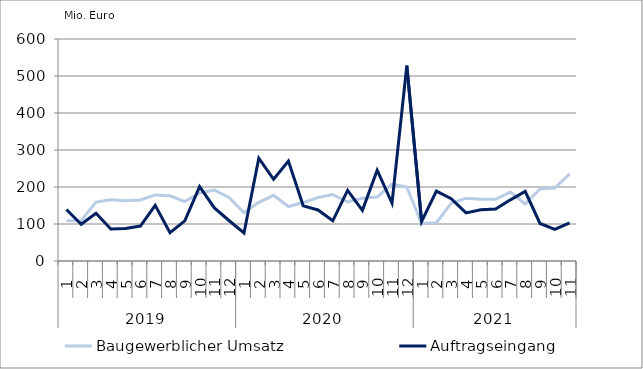
| Category | Baugewerblicher Umsatz | Auftragseingang |
|---|---|---|
| 0 | 108616.605 | 139065.287 |
| 1 | 109331.58 | 99318.609 |
| 2 | 159117.81 | 129002.041 |
| 3 | 165654.287 | 86579.2 |
| 4 | 162976.056 | 87644.362 |
| 5 | 165026.188 | 94463.186 |
| 6 | 178622.938 | 150345.08 |
| 7 | 176074.101 | 76434.317 |
| 8 | 160663.041 | 108444.162 |
| 9 | 183589.485 | 201122.697 |
| 10 | 191777.213 | 143514.792 |
| 11 | 170885.223 | 108780.022 |
| 12 | 130445.562 | 75891.481 |
| 13 | 158433.655 | 277923.85 |
| 14 | 177529.832 | 220973.626 |
| 15 | 147259.799 | 269936.091 |
| 16 | 157965.891 | 149072.895 |
| 17 | 171647.778 | 137984.76 |
| 18 | 179530.732 | 108645.965 |
| 19 | 159480.457 | 190771.468 |
| 20 | 169638.111 | 136988.906 |
| 21 | 173040.053 | 245341.603 |
| 22 | 207619.085 | 156647.224 |
| 23 | 199947.086 | 528166.004 |
| 24 | 101295.895 | 106850.127 |
| 25 | 103236.543 | 188883.434 |
| 26 | 156172.725 | 168204.42 |
| 27 | 169257.088 | 130052.073 |
| 28 | 166897.821 | 138492.214 |
| 29 | 166720.216 | 140262.426 |
| 30 | 186515.191 | 165331.191 |
| 31 | 154188.941 | 188169.655 |
| 32 | 194464.12 | 101359.538 |
| 33 | 197281.201 | 85626.862 |
| 34 | 235325.083 | 102880.924 |